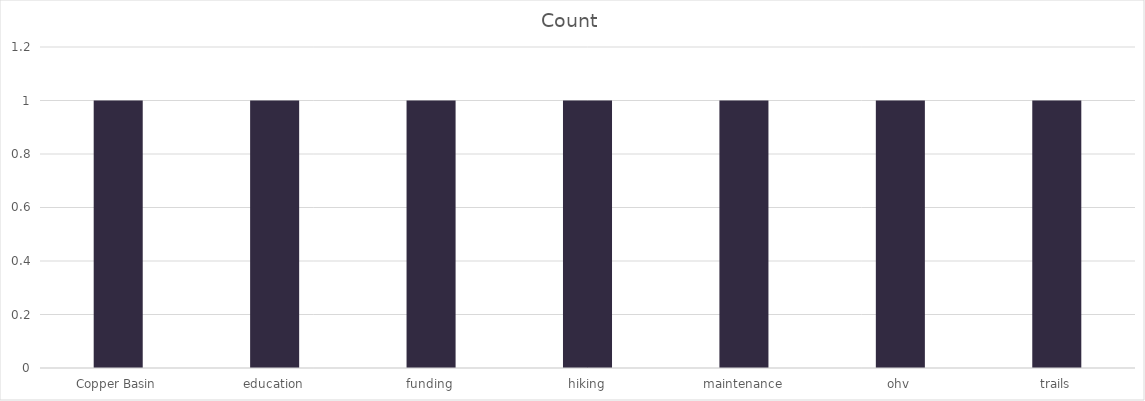
| Category | Count |
|---|---|
| Copper Basin | 1 |
| education | 1 |
| funding | 1 |
| hiking | 1 |
| maintenance | 1 |
| ohv | 1 |
| trails | 1 |